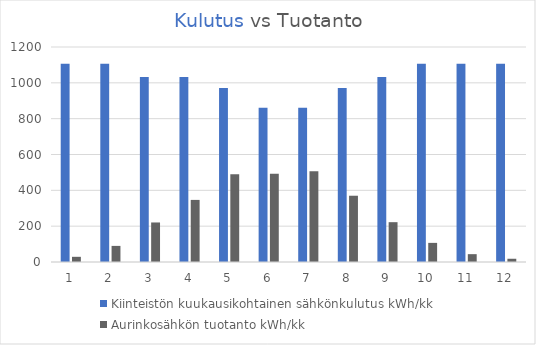
| Category | Kiinteistön kuukausikohtainen sähkönkulutus kWh/kk | Aurinkosähkön tuotanto kWh/kk |
|---|---|---|
| 0 | 1107 | 28.939 |
| 1 | 1107 | 89.85 |
| 2 | 1033.2 | 220.657 |
| 3 | 1033.2 | 346.563 |
| 4 | 971.7 | 489.244 |
| 5 | 861 | 492.715 |
| 6 | 861 | 506.426 |
| 7 | 971.7 | 369.872 |
| 8 | 1033.2 | 222.291 |
| 9 | 1107 | 106.711 |
| 10 | 1107 | 43.758 |
| 11 | 1107 | 18.087 |